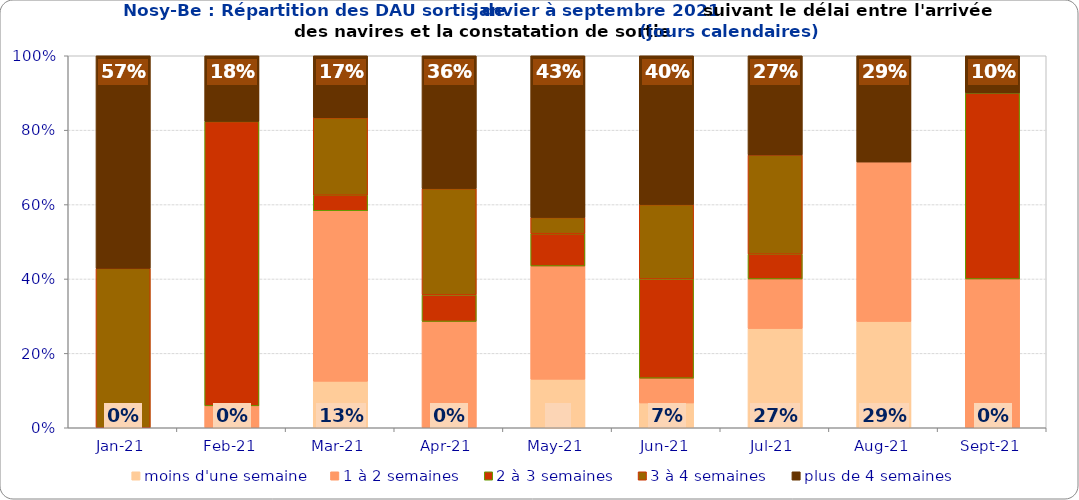
| Category | moins d'une semaine | 1 à 2 semaines | 2 à 3 semaines | 3 à 4 semaines | plus de 4 semaines |
|---|---|---|---|---|---|
| 2021-01-01 | 0 | 0 | 0 | 0.429 | 0.571 |
| 2021-02-01 | 0 | 0.059 | 0.765 | 0 | 0.176 |
| 2021-03-01 | 0.125 | 0.458 | 0.042 | 0.208 | 0.167 |
| 2021-04-01 | 0 | 0.286 | 0.071 | 0.286 | 0.357 |
| 2021-05-01 | 0.13 | 0.304 | 0.087 | 0.043 | 0.435 |
| 2021-06-01 | 0.067 | 0.067 | 0.267 | 0.2 | 0.4 |
| 2021-07-01 | 0.267 | 0.133 | 0.067 | 0.267 | 0.267 |
| 2021-08-01 | 0.286 | 0.429 | 0 | 0 | 0.286 |
| 2021-09-01 | 0 | 0.4 | 0.5 | 0 | 0.1 |